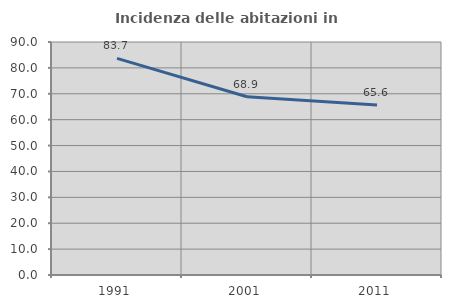
| Category | Incidenza delle abitazioni in proprietà  |
|---|---|
| 1991.0 | 83.676 |
| 2001.0 | 68.872 |
| 2011.0 | 65.639 |